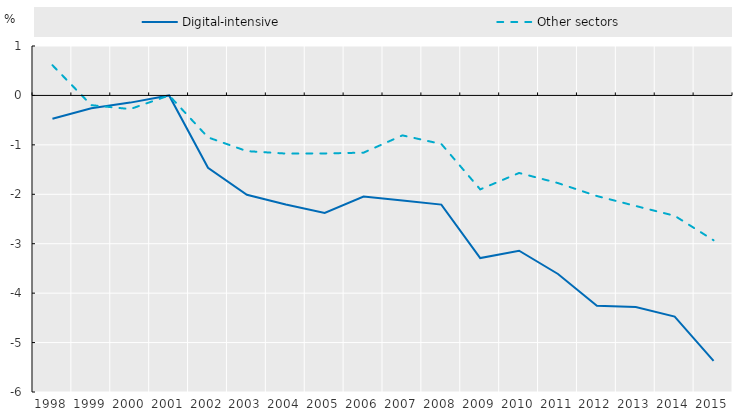
| Category | Digital-intensive | Other sectors |
|---|---|---|
| 1998.0 | -0.473 | 0.611 |
| 1999.0 | -0.262 | -0.197 |
| 2000.0 | -0.145 | -0.276 |
| 2001.0 | 0 | 0 |
| 2002.0 | -1.463 | -0.849 |
| 2003.0 | -2.01 | -1.127 |
| 2004.0 | -2.205 | -1.176 |
| 2005.0 | -2.379 | -1.173 |
| 2006.0 | -2.046 | -1.158 |
| 2007.0 | -2.124 | -0.808 |
| 2008.0 | -2.209 | -0.982 |
| 2009.0 | -3.29 | -1.901 |
| 2010.0 | -3.142 | -1.569 |
| 2011.0 | -3.612 | -1.773 |
| 2012.0 | -4.257 | -2.035 |
| 2013.0 | -4.281 | -2.237 |
| 2014.0 | -4.476 | -2.435 |
| 2015.0 | -5.372 | -2.93 |